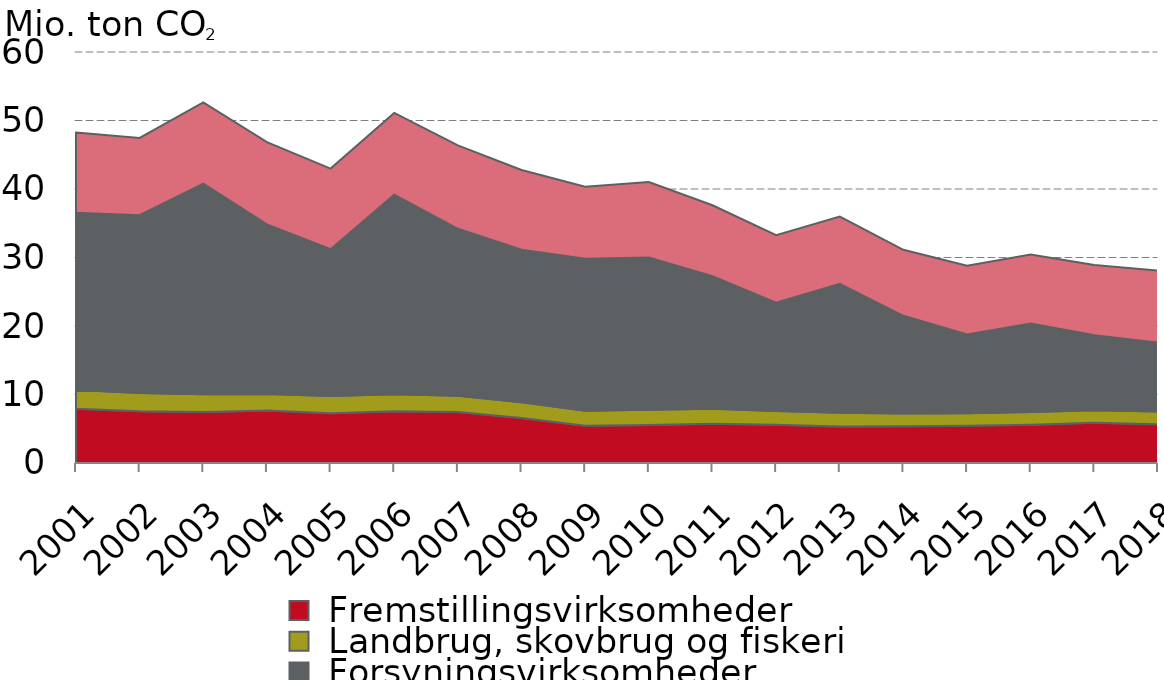
| Category |  Fremstillingsvirksomheder |  Landbrug, skovbrug og fiskeri |  Forsyningsvirksomheder |  Øvrige virksomheder |
|---|---|---|---|---|
| 2001.0 | 7.912 | 2.761 | 25.842 | 11.724 |
| 2002.0 | 7.558 | 2.663 | 25.961 | 11.267 |
| 2003.0 | 7.457 | 2.59 | 30.718 | 11.882 |
| 2004.0 | 7.647 | 2.435 | 24.745 | 12.013 |
| 2005.0 | 7.264 | 2.51 | 21.429 | 11.772 |
| 2006.0 | 7.54 | 2.497 | 29.145 | 11.931 |
| 2007.0 | 7.442 | 2.383 | 24.362 | 12.181 |
| 2008.0 | 6.586 | 2.284 | 22.273 | 11.625 |
| 2009.0 | 5.451 | 2.172 | 22.196 | 10.527 |
| 2010.0 | 5.555 | 2.207 | 22.235 | 11.013 |
| 2011.0 | 5.748 | 2.182 | 19.357 | 10.345 |
| 2012.0 | 5.599 | 1.976 | 15.843 | 9.854 |
| 2013.0 | 5.336 | 2.005 | 18.818 | 9.819 |
| 2014.0 | 5.377 | 1.848 | 14.265 | 9.633 |
| 2015.0 | 5.431 | 1.844 | 11.492 | 10.042 |
| 2016.0 | 5.567 | 1.884 | 12.906 | 10.07 |
| 2017.0 | 5.878 | 1.811 | 10.955 | 10.276 |
| 2018.0 | 5.666 | 1.849 | 10.041 | 10.537 |